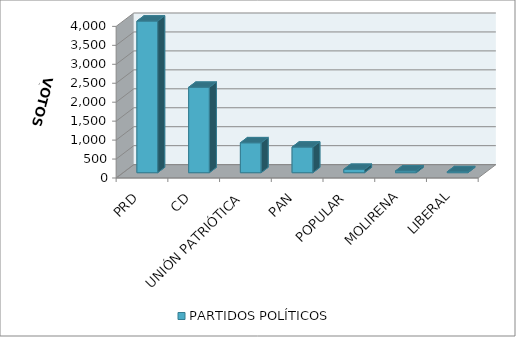
| Category | PARTIDOS POLÍTICOS |
|---|---|
| PRD | 4000 |
| CD | 2253 |
| UNIÓN PATRIÓTICA | 789 |
| PAN | 676 |
| POPULAR | 88 |
| MOLIRENA | 47 |
| LIBERAL | 26 |